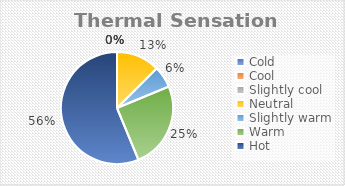
| Category | Series 0 |
|---|---|
| Cold | 0 |
| Cool | 0 |
| Slightly cool | 0 |
| Neutral | 0.125 |
| Slightly warm  | 0.062 |
| Warm | 0.25 |
| Hot | 0.562 |